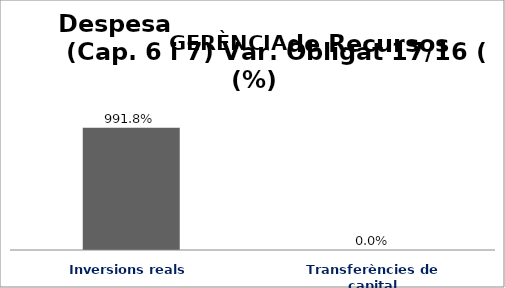
| Category | Series 0 |
|---|---|
| Inversions reals | 9.918 |
| Transferències de capital | 0 |